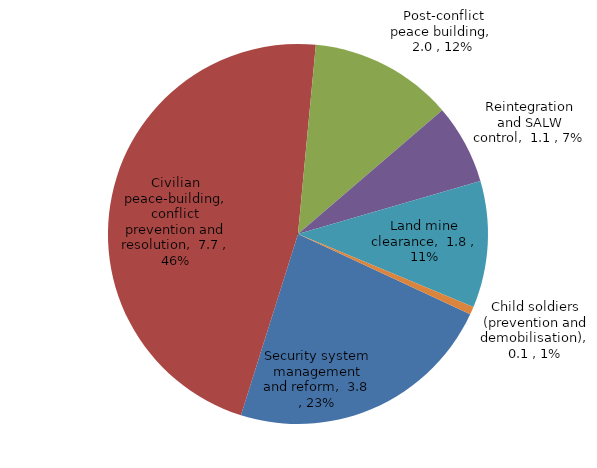
| Category | Series 0 |
|---|---|
| Security system management and reform | 3.794 |
| Civilian peace-building, conflict prevention and resolution | 7.724 |
| Post-conflict peace building | 2.023 |
| Reintegration and SALW control | 1.122 |
| Land mine clearance | 1.785 |
| Child soldiers (prevention and demobilisation) | 0.111 |